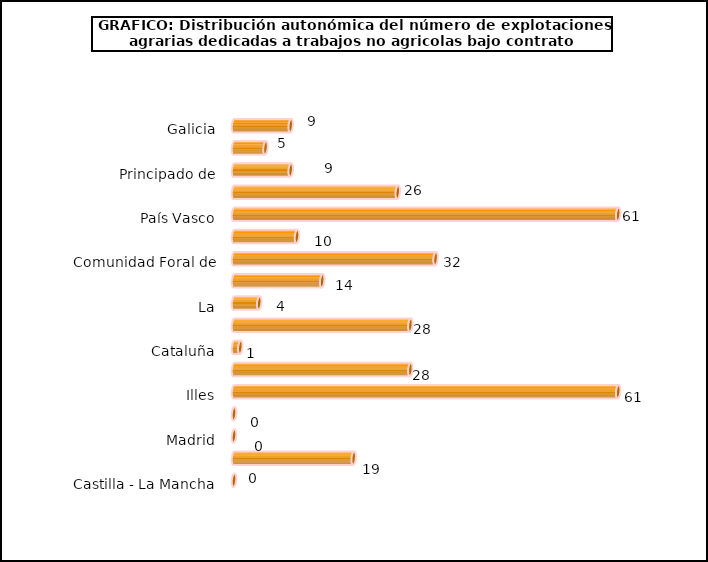
| Category | Series 0 |
|---|---|
| 0 | 9 |
| 1 | 5 |
| 2 | 9 |
| 3 | 26 |
| 4 | 61 |
| 5 | 10 |
| 6 | 32 |
| 7 | 14 |
| 8 | 4 |
| 9 | 28 |
| 10 | 1 |
| 11 | 28 |
| 12 | 61 |
| 13 | 0 |
| 14 | 0 |
| 15 | 19 |
| 16 | 0 |